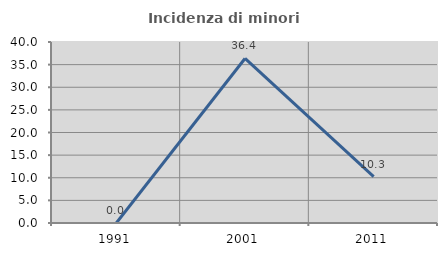
| Category | Incidenza di minori stranieri |
|---|---|
| 1991.0 | 0 |
| 2001.0 | 36.364 |
| 2011.0 | 10.256 |